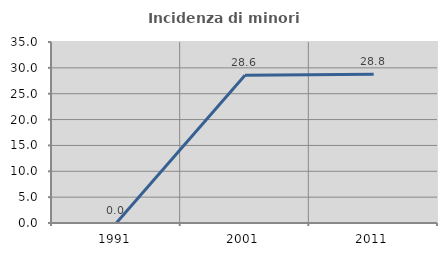
| Category | Incidenza di minori stranieri |
|---|---|
| 1991.0 | 0 |
| 2001.0 | 28.571 |
| 2011.0 | 28.788 |